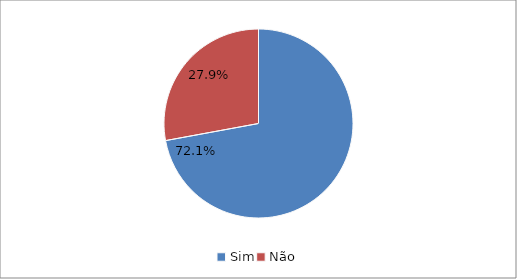
| Category | Series 0 |
|---|---|
| Sim | 0.721 |
| Não | 0.279 |